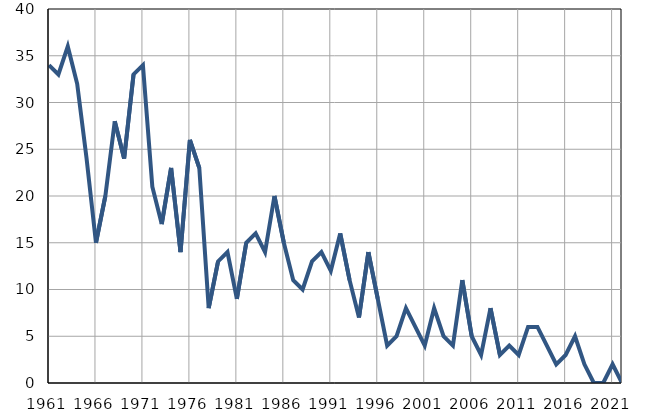
| Category | Умрла 
одојчад |
|---|---|
| 1961.0 | 34 |
| 1962.0 | 33 |
| 1963.0 | 36 |
| 1964.0 | 32 |
| 1965.0 | 24 |
| 1966.0 | 15 |
| 1967.0 | 20 |
| 1968.0 | 28 |
| 1969.0 | 24 |
| 1970.0 | 33 |
| 1971.0 | 34 |
| 1972.0 | 21 |
| 1973.0 | 17 |
| 1974.0 | 23 |
| 1975.0 | 14 |
| 1976.0 | 26 |
| 1977.0 | 23 |
| 1978.0 | 8 |
| 1979.0 | 13 |
| 1980.0 | 14 |
| 1981.0 | 9 |
| 1982.0 | 15 |
| 1983.0 | 16 |
| 1984.0 | 14 |
| 1985.0 | 20 |
| 1986.0 | 15 |
| 1987.0 | 11 |
| 1988.0 | 10 |
| 1989.0 | 13 |
| 1990.0 | 14 |
| 1991.0 | 12 |
| 1992.0 | 16 |
| 1993.0 | 11 |
| 1994.0 | 7 |
| 1995.0 | 14 |
| 1996.0 | 9 |
| 1997.0 | 4 |
| 1998.0 | 5 |
| 1999.0 | 8 |
| 2000.0 | 6 |
| 2001.0 | 4 |
| 2002.0 | 8 |
| 2003.0 | 5 |
| 2004.0 | 4 |
| 2005.0 | 11 |
| 2006.0 | 5 |
| 2007.0 | 3 |
| 2008.0 | 8 |
| 2009.0 | 3 |
| 2010.0 | 4 |
| 2011.0 | 3 |
| 2012.0 | 6 |
| 2013.0 | 6 |
| 2014.0 | 4 |
| 2015.0 | 2 |
| 2016.0 | 3 |
| 2017.0 | 5 |
| 2018.0 | 2 |
| 2019.0 | 0 |
| 2020.0 | 0 |
| 2021.0 | 2 |
| 2022.0 | 0 |